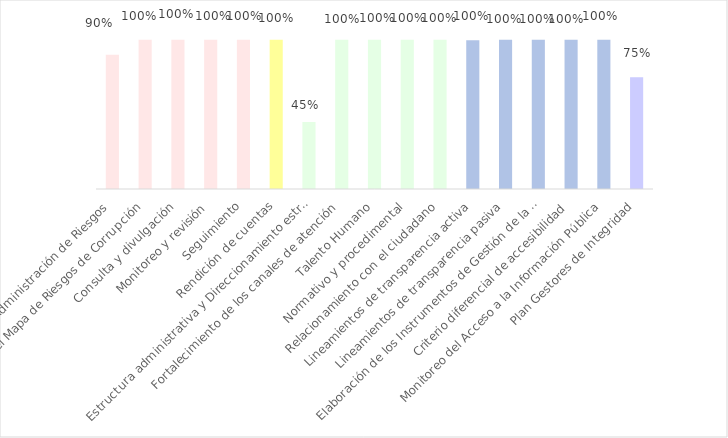
| Category | % Avance cuatrimestral |
|---|---|
| Política de Administración de Riesgos | 0.9 |
| Construcción del Mapa de Riesgos de Corrupción | 1 |
| Consulta y divulgación | 1 |
| Monitoreo y revisión | 1 |
| Seguimiento | 1 |
| Rendición de cuentas | 1 |
| Estructura administrativa y Direccionamiento estratégico | 0.45 |
| Fortalecimiento de los canales de atención | 1 |
| Talento Humano | 1 |
| Normativo y procedimental | 1 |
| Relacionamiento con el ciudadano | 1 |
| Lineamientos de transparencia activa | 0.997 |
| Lineamientos de transparencia pasiva | 1 |
|  Elaboración de los Instrumentos de Gestión de la Información  | 1 |
| Criterio diferencial de accesibilidad | 1 |
| Monitoreo del Acceso a la Información Pública | 1 |
| Plan Gestores de Integridad | 0.75 |